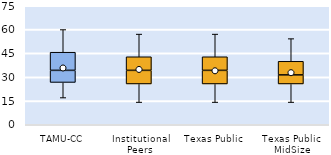
| Category | 25th | 50th | 75th |
|---|---|---|---|
| TAMU-CC | 26.667 | 7.619 | 11.429 |
| Institutional Peers | 25.714 | 8.571 | 8.571 |
| Texas Public | 25.714 | 8.571 | 8.571 |
| Texas Public MidSize | 25.714 | 5.714 | 8.571 |